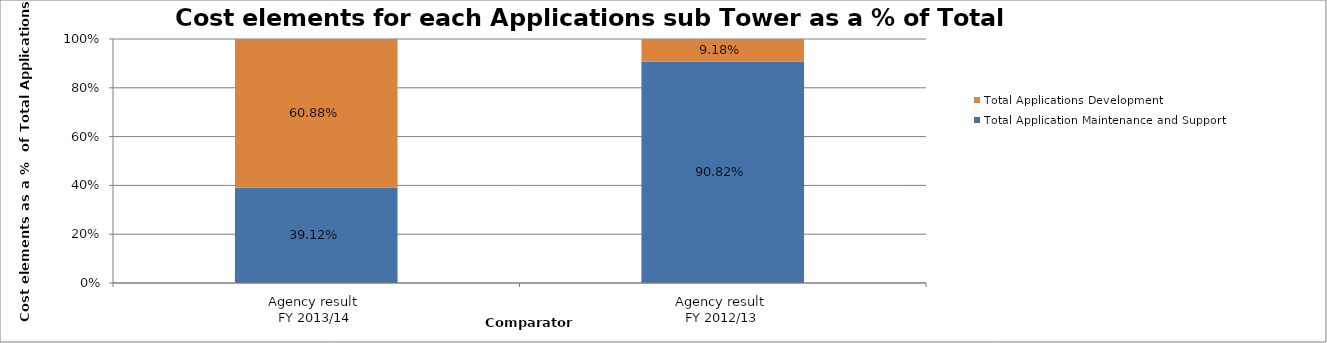
| Category | Total Application Maintenance and Support | Total Applications Development |
|---|---|---|
| Agency result 
FY 2013/14 | 0.391 | 0.609 |
| Agency result 
FY 2012/13 | 0.908 | 0.092 |